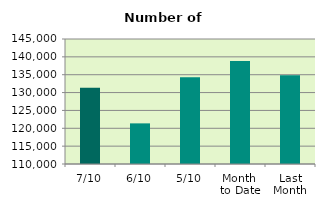
| Category | Series 0 |
|---|---|
| 7/10 | 131370 |
| 6/10 | 121376 |
| 5/10 | 134298 |
| Month 
to Date | 138837.2 |
| Last
Month | 134880 |